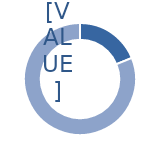
| Category | Series 0 |
|---|---|
| 0 | 0.189 |
| 1 | 0.811 |